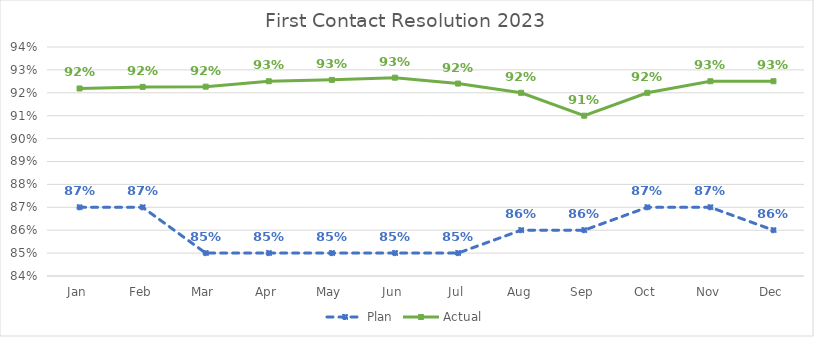
| Category | Plan | Actual |
|---|---|---|
| Jan | 0.87 | 0.922 |
| Feb | 0.87 | 0.923 |
| Mar | 0.85 | 0.923 |
| Apr | 0.85 | 0.925 |
| May | 0.85 | 0.926 |
| Jun | 0.85 | 0.927 |
| Jul | 0.85 | 0.924 |
| Aug | 0.86 | 0.92 |
| Sep | 0.86 | 0.91 |
| Oct | 0.87 | 0.92 |
| Nov | 0.87 | 0.925 |
| Dec | 0.86 | 0.925 |